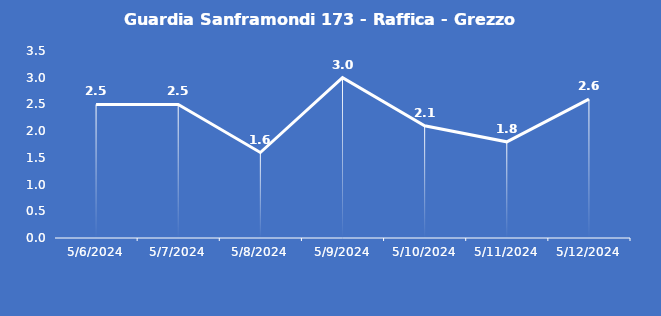
| Category | Guardia Sanframondi 173 - Raffica - Grezzo (m/s) |
|---|---|
| 5/6/24 | 2.5 |
| 5/7/24 | 2.5 |
| 5/8/24 | 1.6 |
| 5/9/24 | 3 |
| 5/10/24 | 2.1 |
| 5/11/24 | 1.8 |
| 5/12/24 | 2.6 |